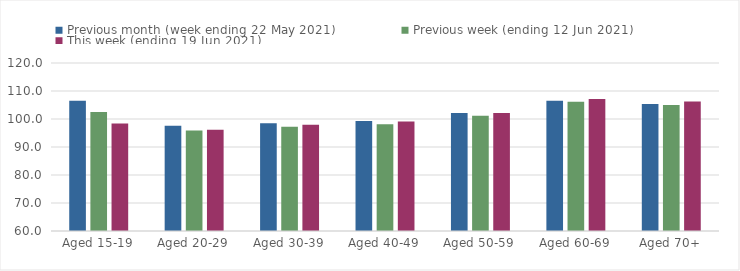
| Category | Previous month (week ending 22 May 2021) | Previous week (ending 12 Jun 2021) | This week (ending 19 Jun 2021) |
|---|---|---|---|
| Aged 15-19 | 106.56 | 102.51 | 98.42 |
| Aged 20-29 | 97.6 | 95.9 | 96.15 |
| Aged 30-39 | 98.51 | 97.22 | 97.96 |
| Aged 40-49 | 99.27 | 98.09 | 99.09 |
| Aged 50-59 | 102.16 | 101.15 | 102.1 |
| Aged 60-69 | 106.5 | 106.15 | 107.1 |
| Aged 70+ | 105.34 | 105.01 | 106.25 |